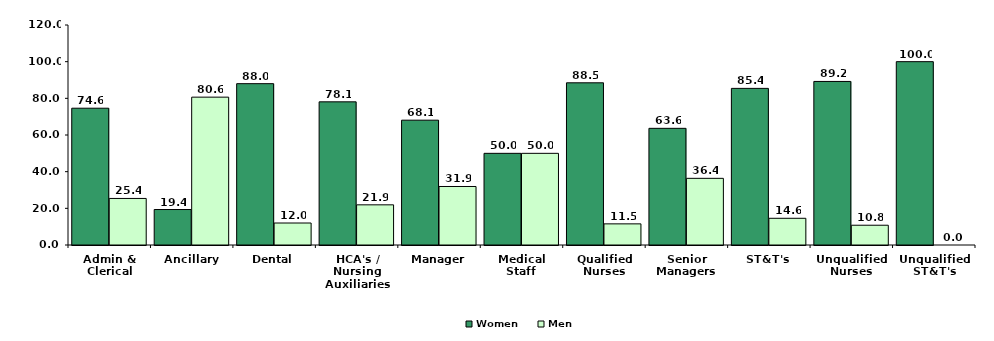
| Category | Women | Men |
|---|---|---|
| Admin & Clerical | 74.608 | 25.392 |
| Ancillary | 19.355 | 80.645 |
| Dental | 88 | 12 |
| HCA's / Nursing Auxiliaries | 78.093 | 21.907 |
| Manager | 68.085 | 31.915 |
| Medical Staff | 50 | 50 |
| Qualified Nurses | 88.473 | 11.527 |
| Senior Managers | 63.636 | 36.364 |
| ST&T's | 85.432 | 14.568 |
| Unqualified Nurses | 89.216 | 10.784 |
| Unqualified ST&T's | 100 | 0 |